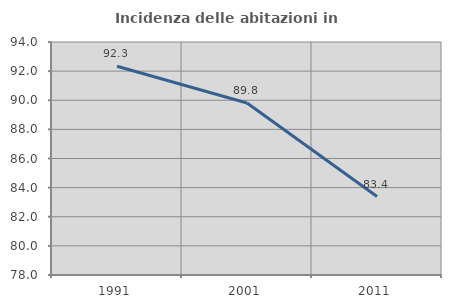
| Category | Incidenza delle abitazioni in proprietà  |
|---|---|
| 1991.0 | 92.331 |
| 2001.0 | 89.815 |
| 2011.0 | 83.388 |